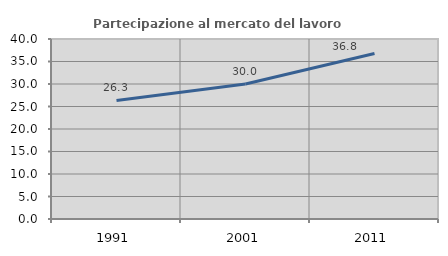
| Category | Partecipazione al mercato del lavoro  femminile |
|---|---|
| 1991.0 | 26.348 |
| 2001.0 | 30 |
| 2011.0 | 36.788 |